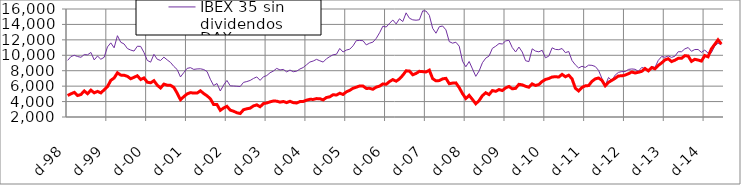
| Category | IBEX 35 sin dividendos | DAX |
|---|---|---|
| 1998-12-01 | 9339.8 | 4781.73 |
| 1999-01-01 | 9836.6 | 5002.39 |
| 1999-02-01 | 9998.2 | 5190.82 |
| 1999-03-01 | 9838.9 | 4784.31 |
| 1999-04-01 | 9740.7 | 4914.59 |
| 1999-05-01 | 10090.8 | 5377.56 |
| 1999-06-01 | 10056.9 | 5021.24 |
| 1999-07-01 | 10370.5 | 5480.22 |
| 1999-08-01 | 9400.1 | 5129.5 |
| 1999-09-01 | 9903.6 | 5317.12 |
| 1999-10-01 | 9482.8 | 5124.55 |
| 1999-11-01 | 9741.5 | 5524.92 |
| 1999-12-01 | 11084.3 | 5933.84 |
| 2000-01-01 | 11610 | 6750.76 |
| 2000-02-01 | 10970 | 7050.46 |
| 2000-03-01 | 12538.7 | 7727.93 |
| 2000-04-01 | 11686.4 | 7429.22 |
| 2000-05-01 | 11467.9 | 7414.68 |
| 2000-06-01 | 10875.5 | 7272.76 |
| 2000-07-01 | 10676.7 | 6958.96 |
| 2000-08-01 | 10549 | 7145.53 |
| 2000-09-01 | 11170.1 | 7344.67 |
| 2000-10-01 | 11152.5 | 6862.26 |
| 2000-11-01 | 10363.1 | 7059.07 |
| 2000-12-01 | 9339.4 | 6512.91 |
| 2001-01-01 | 9109.8 | 6433.61 |
| 2001-02-01 | 10123 | 6704.68 |
| 2001-03-01 | 9486.1 | 6123.38 |
| 2001-04-01 | 9324.3 | 5760.76 |
| 2001-05-01 | 9761 | 6264.51 |
| 2001-06-01 | 9399.4 | 6125.17 |
| 2001-07-01 | 9073.3 | 6109.5 |
| 2001-08-01 | 8557.3 | 5835.23 |
| 2001-09-01 | 8153 | 5094.1 |
| 2001-10-01 | 7193.1 | 4239.97 |
| 2001-11-01 | 7754.8 | 4636.13 |
| 2001-12-01 | 8302.9 | 4988.44 |
| 2002-01-01 | 8397.6 | 5160.1 |
| 2002-02-01 | 8171.1 | 5097.06 |
| 2002-03-01 | 8230.7 | 5097.41 |
| 2002-04-01 | 8249.7 | 5397.29 |
| 2002-05-01 | 8154.4 | 5041.2 |
| 2002-06-01 | 7899.7 | 4747.95 |
| 2002-07-01 | 6893.6 | 4366.81 |
| 2002-08-01 | 6074.9 | 3606.45 |
| 2002-09-01 | 6341.3 | 3609.41 |
| 2002-10-01 | 5368.6 | 2865.23 |
| 2002-11-01 | 6139.4 | 3165.16 |
| 2002-12-01 | 6736.3 | 3380.2 |
| 2003-01-01 | 6036.9 | 2892.63 |
| 2003-02-01 | 6017.2 | 2751.99 |
| 2003-03-01 | 5987.2 | 2549.65 |
| 2003-04-01 | 5953.2 | 2450.19 |
| 2003-05-01 | 6489.5 | 2942.04 |
| 2003-06-01 | 6595.4 | 3064.56 |
| 2003-07-01 | 6739.1 | 3146.55 |
| 2003-08-01 | 6995.4 | 3438.89 |
| 2003-09-01 | 7194.4 | 3571.22 |
| 2003-10-01 | 6751 | 3329.83 |
| 2003-11-01 | 7215.3 | 3744.5 |
| 2003-12-01 | 7372.3 | 3821.2 |
| 2004-01-01 | 7737.2 | 3965.16 |
| 2004-02-01 | 7958.6 | 4071.6 |
| 2004-03-01 | 8300.4 | 4054.43 |
| 2004-04-01 | 8097.9 | 3924.85 |
| 2004-05-01 | 8170.6 | 4007.65 |
| 2004-06-01 | 7848.4 | 3864.18 |
| 2004-07-01 | 8085.3 | 4035.02 |
| 2004-08-01 | 7869 | 3862.71 |
| 2004-09-01 | 7938.9 | 3817.62 |
| 2004-10-01 | 8220.6 | 3994.96 |
| 2004-11-01 | 8418.3 | 4012.64 |
| 2004-12-01 | 8773.9 | 4186.03 |
| 2005-01-01 | 9124.1 | 4291.53 |
| 2005-02-01 | 9257 | 4279.97 |
| 2005-03-01 | 9472.3 | 4383.62 |
| 2005-04-01 | 9289.5 | 4373.53 |
| 2005-05-01 | 9119.9 | 4224.02 |
| 2005-06-01 | 9550.8 | 4527.17 |
| 2005-07-01 | 9829.1 | 4617.07 |
| 2005-08-01 | 10068.9 | 4890.85 |
| 2005-09-01 | 10134.1 | 4842.94 |
| 2005-10-01 | 10880.7 | 5082.07 |
| 2005-11-01 | 10427.2 | 4922.55 |
| 2005-12-01 | 10678.7 | 5266.55 |
| 2006-01-01 | 10786.7 | 5449.98 |
| 2006-02-01 | 11221.1 | 5726.53 |
| 2006-03-01 | 11902.2 | 5866.61 |
| 2006-04-01 | 11920 | 6024.05 |
| 2006-05-01 | 11892.5 | 6009.89 |
| 2006-06-01 | 11346.4 | 5707.59 |
| 2006-07-01 | 11569.6 | 5712.69 |
| 2006-08-01 | 11706.6 | 5596.74 |
| 2006-09-01 | 12193 | 5876.54 |
| 2006-10-01 | 12915.9 | 5999.46 |
| 2006-11-01 | 13772.6 | 6291.9 |
| 2006-12-01 | 13660.6 | 6241.13 |
| 2007-01-01 | 14146.5 | 6596.92 |
| 2007-02-01 | 14571.5 | 6851.28 |
| 2007-03-01 | 14064.9 | 6640.24 |
| 2007-04-01 | 14730.8 | 6937.17 |
| 2007-05-01 | 14374.6 | 7408.87 |
| 2007-06-01 | 15501.5 | 7987.85 |
| 2007-07-01 | 14804.7 | 7958.24 |
| 2007-08-01 | 14595.7 | 7473.93 |
| 2007-09-01 | 14546.9 | 7648.58 |
| 2007-10-01 | 14603 | 7922.42 |
| 2007-11-01 | 15759.6 | 7880.85 |
| 2007-12-01 | 15735 | 7837.26 |
| 2008-01-01 | 15182.3 | 8067.32 |
| 2008-02-01 | 13494.7 | 6968.67 |
| 2008-03-01 | 12862.5 | 6689.95 |
| 2008-04-01 | 13699.1 | 6720.33 |
| 2008-05-01 | 13798.3 | 6948.82 |
| 2008-06-01 | 13300 | 7008.77 |
| 2008-07-01 | 11770.9 | 6315.94 |
| 2008-08-01 | 11569.5 | 6396.46 |
| 2008-09-01 | 11693.8 | 6421.8 |
| 2008-10-01 | 11182.5 | 5806.33 |
| 2008-11-01 | 9231.8 | 5026.84 |
| 2008-12-01 | 8510.5 | 4394.79 |
| 2009-01-01 | 9195.8 | 4810.2 |
| 2009-02-01 | 8233.4 | 4271.04 |
| 2009-03-01 | 7270.5 | 3710.07 |
| 2009-04-01 | 7961 | 4131.07 |
| 2009-05-01 | 9038 | 4769.45 |
| 2009-06-01 | 9630.9 | 5142.56 |
| 2009-07-01 | 9903.7 | 4905.44 |
| 2009-08-01 | 10901 | 5426.85 |
| 2009-09-01 | 11173 | 5327.29 |
| 2009-10-01 | 11518.2 | 5554.55 |
| 2009-11-01 | 11465.8 | 5430.82 |
| 2009-12-01 | 11862.1 | 5776.61 |
| 2010-01-01 | 11940 | 5957.43 |
| 2010-02-01 | 10995.2 | 5654.48 |
| 2010-03-01 | 10434.9 | 5713.51 |
| 2010-04-01 | 11067.9 | 6235.56 |
| 2010-05-01 | 10422.8 | 6166.92 |
| 2010-06-01 | 9299.7 | 5981.27 |
| 2010-07-01 | 9178.2 | 5857.43 |
| 2010-08-01 | 10835.4 | 6292.13 |
| 2010-09-01 | 10544.8 | 6083.9 |
| 2010-10-01 | 10450.1 | 6211.34 |
| 2010-11-01 | 10649.5 | 6604.86 |
| 2010-12-01 | 9678.4 | 6866.63 |
| 2011-01-01 | 9888.3 | 6989.74 |
| 2011-02-01 | 10967.9 | 7184.27 |
| 2011-03-01 | 10761.9 | 7223.3 |
| 2011-04-01 | 10729.9 | 7179.81 |
| 2011-05-01 | 10877.3 | 7527.64 |
| 2011-06-01 | 10339.3 | 7217.43 |
| 2011-07-01 | 10492 | 7419.44 |
| 2011-08-01 | 9318.2 | 6953.98 |
| 2011-09-01 | 8761.1 | 5730.63 |
| 2011-10-01 | 8353.8 | 5376.7 |
| 2011-11-01 | 8579.6 | 5834.51 |
| 2011-12-01 | 8421 | 6035.88 |
| 2012-01-01 | 8723.8 | 6075.52 |
| 2012-02-01 | 8696.6 | 6616.64 |
| 2012-03-01 | 8547.7 | 6941.77 |
| 2012-04-01 | 8042.8 | 7056.65 |
| 2012-05-01 | 7011 | 6761.19 |
| 2012-06-01 | 6065 | 6050.29 |
| 2012-07-01 | 7124 | 6496.08 |
| 2012-08-01 | 6720 | 6754.46 |
| 2012-09-01 | 7434.2 | 7014.83 |
| 2012-10-01 | 7784.1 | 7326.73 |
| 2012-11-01 | 7886.4 | 7335.67 |
| 2012-12-01 | 7889.2 | 7435.21 |
| 2013-01-01 | 8167.5 | 7612.39 |
| 2013-02-01 | 8229.7 | 7833.39 |
| 2013-03-01 | 8187.1 | 7708.16 |
| 2013-04-01 | 7920 | 7795.31 |
| 2013-05-01 | 8419 | 7913.71 |
| 2013-06-01 | 8284.4 | 8285.8 |
| 2013-07-01 | 7907.1 | 7983.92 |
| 2013-08-01 | 8540.2 | 8410.73 |
| 2013-09-01 | 8429.6 | 8243.87 |
| 2013-10-01 | 9341.5 | 8689.14 |
| 2013-11-01 | 9838.3 | 9007.83 |
| 2013-12-01 | 9745.5 | 9401.96 |
| 2014-01-01 | 9916.7 | 9552.16 |
| 2014-02-01 | 9725.4 | 9186.52 |
| 2014-03-01 | 9878.7 | 9358.89 |
| 2014-04-01 | 10463.1 | 9603.71 |
| 2014-05-01 | 10459 | 9603.23 |
| 2014-06-01 | 10827.4 | 9950.12 |
| 2014-07-01 | 11007.8 | 9902.41 |
| 2014-08-01 | 10514 | 9210.08 |
| 2014-09-01 | 10746.5 | 9479.03 |
| 2014-10-01 | 10753.2 | 9382.03 |
| 2014-11-01 | 10374.4 | 9251.7 |
| 2014-12-01 | 10672.8 | 9963.51 |
| 2015-01-01 | 10279.5 | 9805.55 |
| 2015-02-01 | 10328.1 | 10828.01 |
| 2015-03-01 | 11178.5 | 11410.36 |
| 2015-04-01 | 11569.8 | 12001.38 |
| 2015-05-01 | 11385 | 11454.38 |